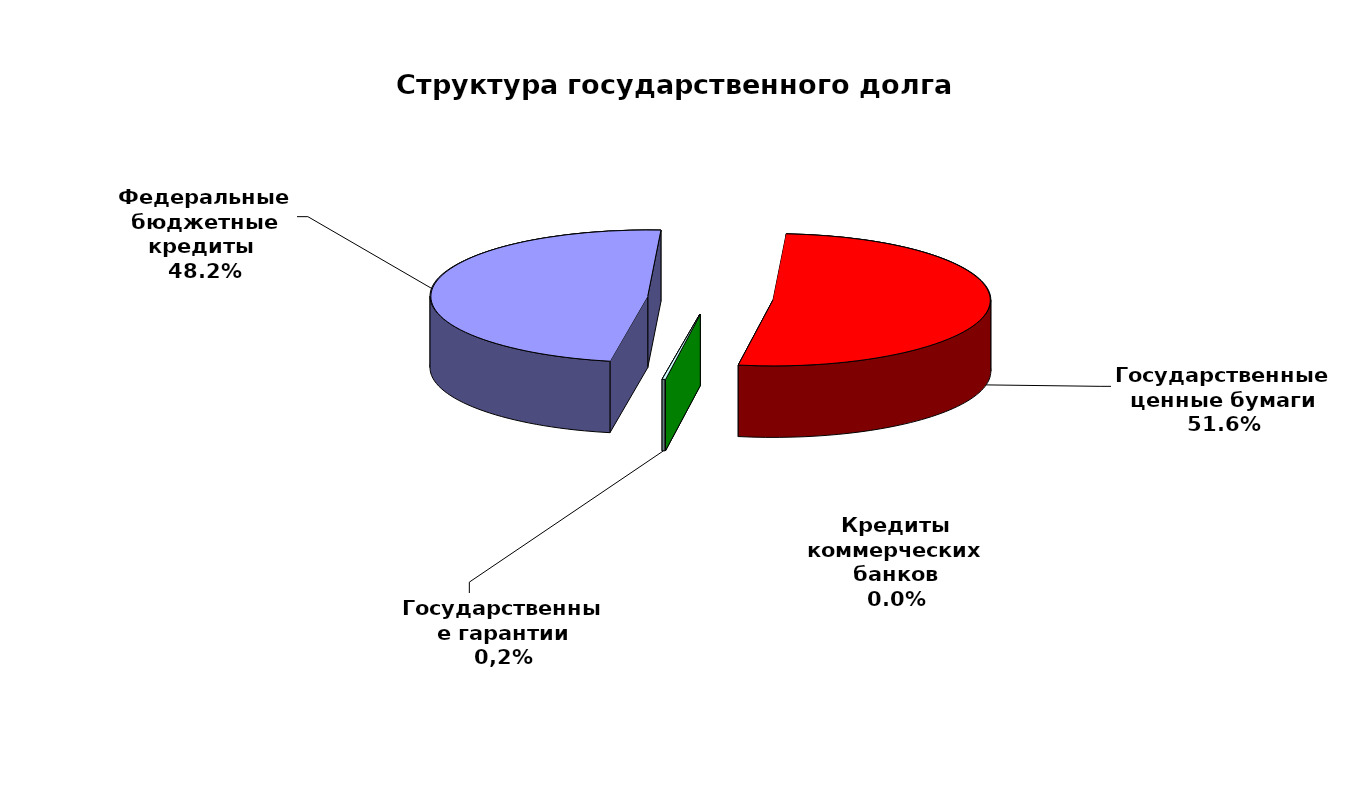
| Category | Series 0 |
|---|---|
| Федеральные бюджетные кредиты  | 34649676.663 |
| Государственные ценные бумаги | 37100000 |
| Кредиты коммерческих банков | 0 |
| Государственные гарантии | 158212.22 |